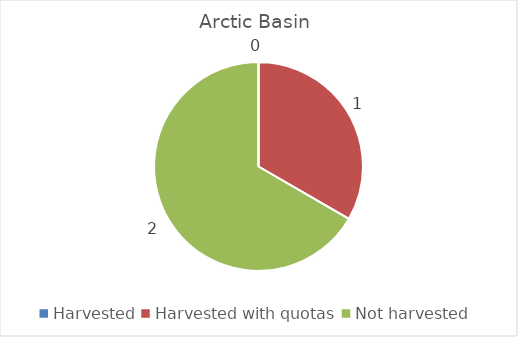
| Category | Arctic Basin |
|---|---|
| Harvested | 0 |
| Harvested with quotas | 1 |
| Not harvested | 2 |